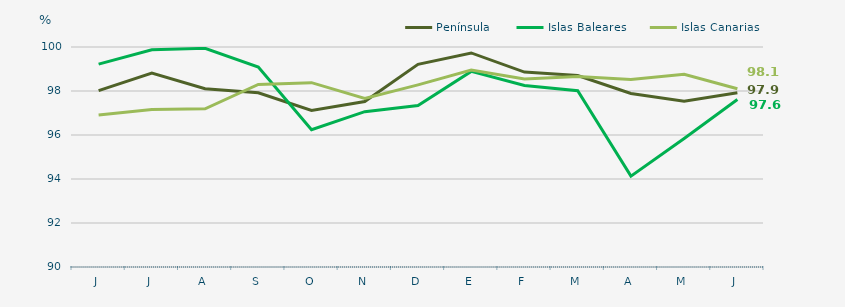
| Category | Península | Islas Baleares | Islas Canarias |
|---|---|---|---|
| J | 98.02 | 99.22 | 96.91 |
| J | 98.81 | 99.87 | 97.16 |
| A | 98.1 | 99.94 | 97.19 |
| S | 97.92 | 99.09 | 98.3 |
| O | 97.12 | 96.24 | 98.38 |
| N | 97.52 | 97.06 | 97.66 |
| D | 99.21 | 97.34 | 98.28 |
| E | 99.73 | 98.89 | 98.95 |
| F | 98.86 | 98.25 | 98.55 |
| M | 98.7 | 98.01 | 98.66 |
| A | 97.89 | 94.13 | 98.52 |
| M | 97.53 | 95.84 | 98.76 |
| J | 97.92 | 97.61 | 98.1 |